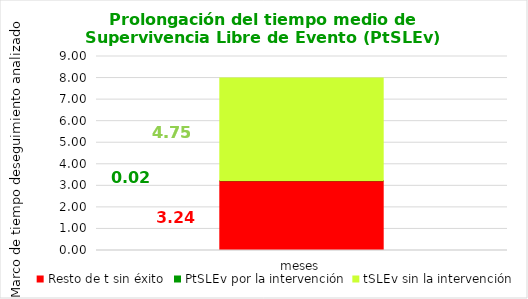
| Category | Resto de t sin éxito | PtSLEv por la intervención | tSLEv sin la intervención |
|---|---|---|---|
| meses | 3.235 | 0.018 | 4.747 |